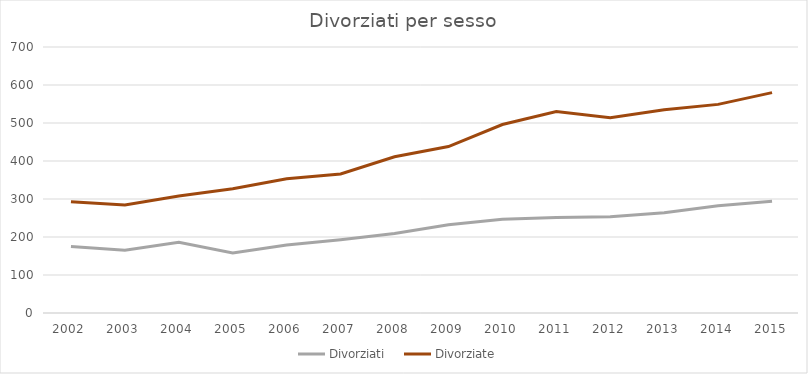
| Category | Divorziati | Divorziate |
|---|---|---|
| 2002.0 | 175 | 293 |
| 2003.0 | 165 | 284 |
| 2004.0 | 186 | 308 |
| 2005.0 | 158 | 327 |
| 2006.0 | 179 | 353 |
| 2007.0 | 193 | 366 |
| 2008.0 | 209 | 411 |
| 2009.0 | 232 | 438 |
| 2010.0 | 247 | 496 |
| 2011.0 | 251 | 530 |
| 2012.0 | 253 | 514 |
| 2013.0 | 264 | 535 |
| 2014.0 | 282 | 549 |
| 2015.0 | 294 | 580 |